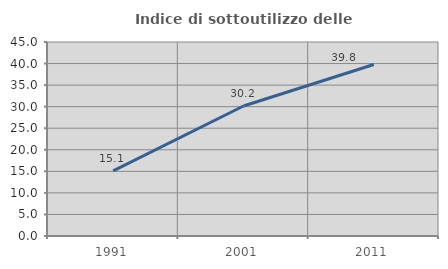
| Category | Indice di sottoutilizzo delle abitazioni  |
|---|---|
| 1991.0 | 15.092 |
| 2001.0 | 30.157 |
| 2011.0 | 39.774 |